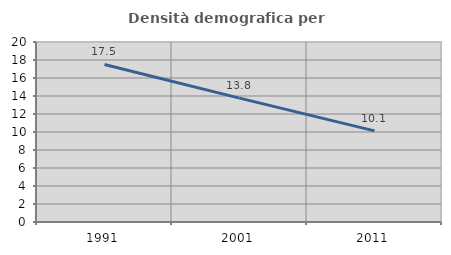
| Category | Densità demografica |
|---|---|
| 1991.0 | 17.502 |
| 2001.0 | 13.764 |
| 2011.0 | 10.124 |